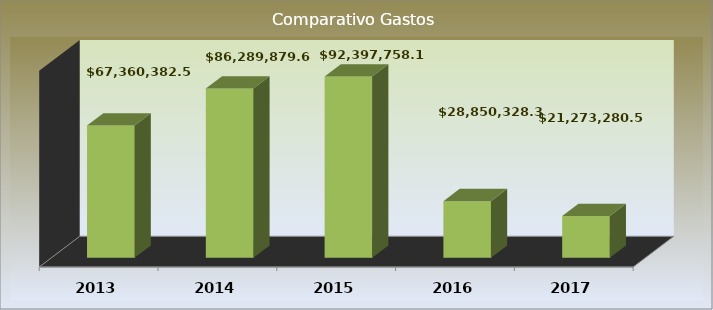
| Category | 2013 2014 2015 2016 2017 |
|---|---|
| 2013.0 | 67360382.57 |
| 2014.0 | 86289879.62 |
| 2015.0 | 92397758.15 |
| 2016.0 | 28850328.39 |
| 2017.0 | 21273280.51 |